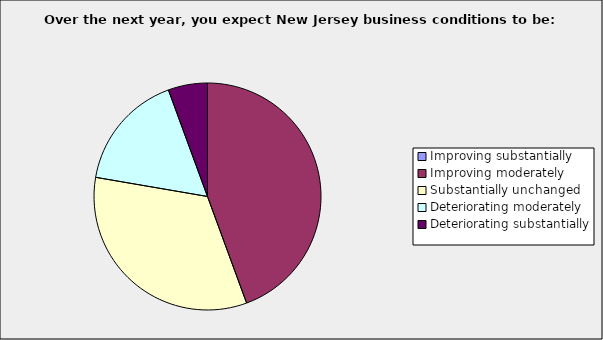
| Category | Series 0 |
|---|---|
| Improving substantially | 0 |
| Improving moderately | 0.444 |
| Substantially unchanged | 0.333 |
| Deteriorating moderately | 0.167 |
| Deteriorating substantially | 0.056 |